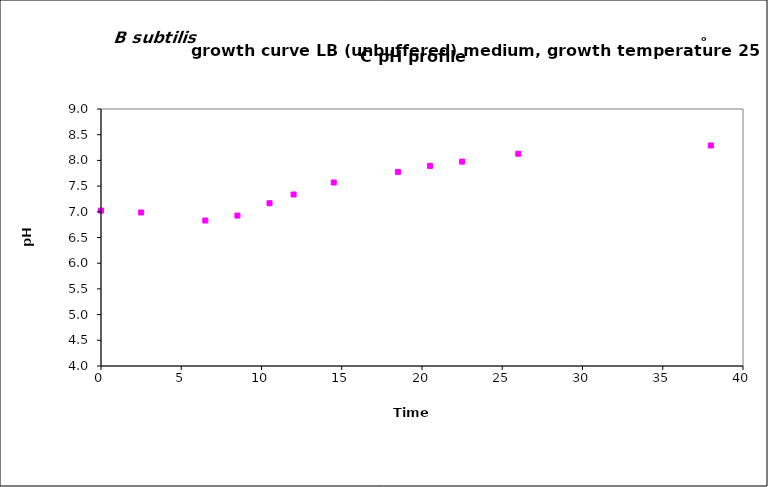
| Category | Series 1 |
|---|---|
| 0.0 | 7.023 |
| 2.5 | 6.987 |
| 6.5 | 6.83 |
| 8.5 | 6.927 |
| 10.5 | 7.167 |
| 12.0 | 7.337 |
| 14.5 | 7.57 |
| 18.5 | 7.777 |
| 20.5 | 7.893 |
| 22.5 | 7.977 |
| 26.0 | 8.13 |
| 38.0 | 8.29 |